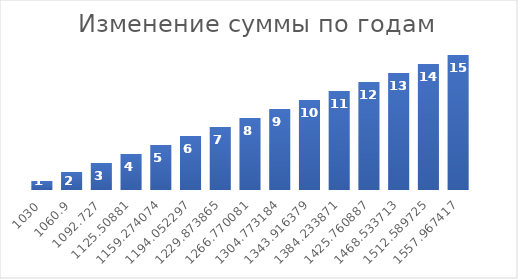
| Category | Series 0 |
|---|---|
| 1030.0 | 1 |
| 1060.9 | 2 |
| 1092.727 | 3 |
| 1125.50881 | 4 |
| 1159.2740743000002 | 5 |
| 1194.0522965290002 | 6 |
| 1229.8738654248702 | 7 |
| 1266.7700813876163 | 8 |
| 1304.7731838292448 | 9 |
| 1343.916379344122 | 10 |
| 1384.2338707244458 | 11 |
| 1425.7608868461791 | 12 |
| 1468.5337134515646 | 13 |
| 1512.5897248551116 | 14 |
| 1557.967416600765 | 15 |